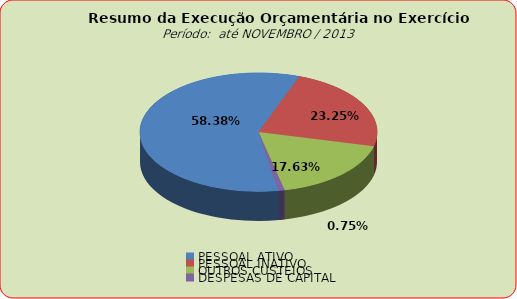
| Category | Series 0 |
|---|---|
| PESSOAL ATIVO | 85713527.79 |
| PESSOAL INATIVO | 34136221.8 |
| OUTROS CUSTEIOS | 25879745.71 |
| DESPESAS DE CAPITAL | 1097202.68 |